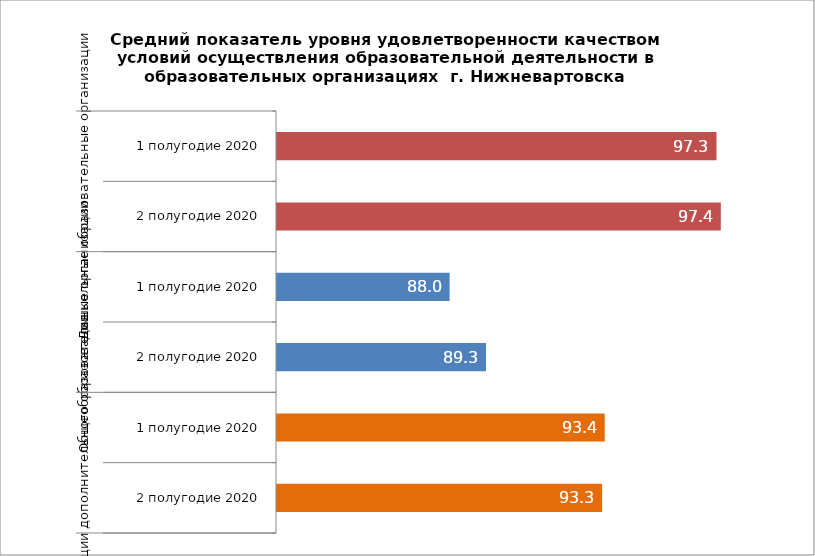
| Category | Series 0 |
|---|---|
| 0 | 97.272 |
| 1 | 97.422 |
| 2 | 87.998 |
| 3 | 89.263 |
| 4 | 93.388 |
| 5 | 93.297 |